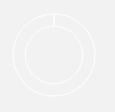
| Category | Series 0 |
|---|---|
| 0 | 0 |
| 1 | 4 |